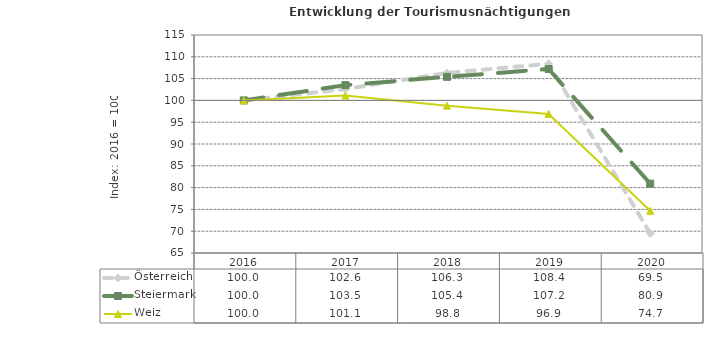
| Category | Österreich | Steiermark | Weiz |
|---|---|---|---|
| 2020.0 | 69.5 | 80.9 | 74.7 |
| 2019.0 | 108.4 | 107.2 | 96.9 |
| 2018.0 | 106.3 | 105.4 | 98.8 |
| 2017.0 | 102.6 | 103.5 | 101.1 |
| 2016.0 | 100 | 100 | 100 |